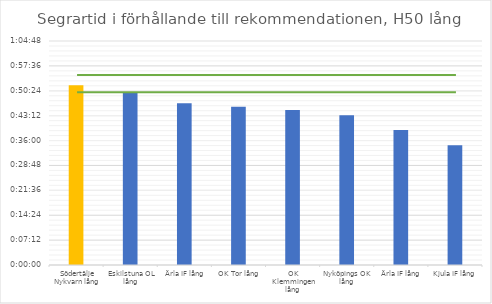
| Category | H50 tid |
|---|---|
| Södertälje Nykvarn lång | 0.036 |
| Eskilstuna OL lång | 0.035 |
| Ärla IF lång | 0.032 |
| OK Tor lång | 0.032 |
| OK Klemmingen lång | 0.031 |
| Nyköpings OK lång | 0.03 |
| Ärla IF lång | 0.027 |
| Kjula IF lång | 0.024 |